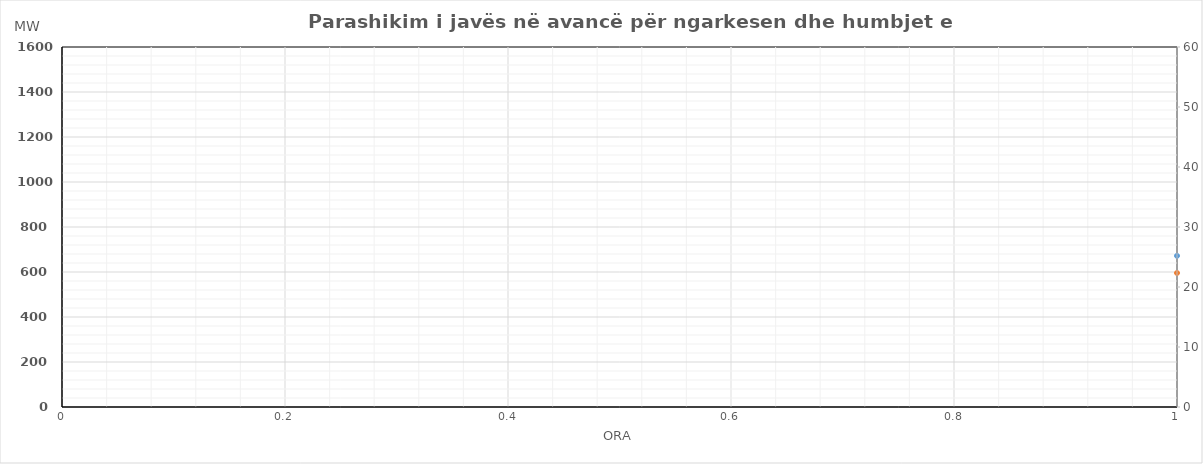
| Category | Ngarkesa (MWh) |
|---|---|
| 0 | 595.73 |
| 1 | 536.53 |
| 2 | 535.73 |
| 3 | 531.58 |
| 4 | 535.89 |
| 5 | 568.72 |
| 6 | 752.35 |
| 7 | 970.69 |
| 8 | 1006.83 |
| 9 | 981.42 |
| 10 | 953.72 |
| 11 | 986.3 |
| 12 | 998.6 |
| 13 | 1046.83 |
| 14 | 1080.29 |
| 15 | 1100.8 |
| 16 | 1176.19 |
| 17 | 1206.28 |
| 18 | 1210.4 |
| 19 | 1189.65 |
| 20 | 1149.94 |
| 21 | 1053.47 |
| 22 | 930.76 |
| 23 | 785.29 |
| 24 | 626.52 |
| 25 | 582.42 |
| 26 | 580.03 |
| 27 | 580.93 |
| 28 | 582.71 |
| 29 | 596.02 |
| 30 | 783.03 |
| 31 | 1019.26 |
| 32 | 1058.46 |
| 33 | 1034.18 |
| 34 | 999.15 |
| 35 | 987.71 |
| 36 | 983.87 |
| 37 | 1010.1 |
| 38 | 1043.5 |
| 39 | 1057.93 |
| 40 | 1135.84 |
| 41 | 1226.83 |
| 42 | 1231.94 |
| 43 | 1218.46 |
| 44 | 1175.26 |
| 45 | 1081.55 |
| 46 | 955.39 |
| 47 | 802.91 |
| 48 | 626.52 |
| 49 | 582.42 |
| 50 | 580.03 |
| 51 | 580.93 |
| 52 | 582.71 |
| 53 | 596.02 |
| 54 | 783.03 |
| 55 | 1019.26 |
| 56 | 1058.46 |
| 57 | 1034.18 |
| 58 | 999.15 |
| 59 | 1087.71 |
| 60 | 1081.87 |
| 61 | 1153.1 |
| 62 | 1148.5 |
| 63 | 1135.93 |
| 64 | 1230.84 |
| 65 | 1256.83 |
| 66 | 1261.94 |
| 67 | 1263.46 |
| 68 | 1245.26 |
| 69 | 1156.55 |
| 70 | 1045.39 |
| 71 | 892.91 |
| 72 | 629.38 |
| 73 | 558.27 |
| 74 | 548.65 |
| 75 | 542.74 |
| 76 | 545.25 |
| 77 | 605.14 |
| 78 | 801.15 |
| 79 | 1046 |
| 80 | 1084.6 |
| 81 | 1131.57 |
| 82 | 1107.92 |
| 83 | 1107.5 |
| 84 | 1108.61 |
| 85 | 1127.31 |
| 86 | 1140.78 |
| 87 | 1127.86 |
| 88 | 1210.86 |
| 89 | 1296.2 |
| 90 | 1274.88 |
| 91 | 1260.46 |
| 92 | 1228.77 |
| 93 | 1164.34 |
| 94 | 1004.54 |
| 95 | 827.01 |
| 96 | 643.55 |
| 97 | 573.42 |
| 98 | 540.92 |
| 99 | 531.33 |
| 100 | 542.24 |
| 101 | 614.81 |
| 102 | 802.18 |
| 103 | 1053.23 |
| 104 | 1137.89 |
| 105 | 1152.3 |
| 106 | 1125.81 |
| 107 | 1155.59 |
| 108 | 1157.96 |
| 109 | 1170.07 |
| 110 | 1178.27 |
| 111 | 1187.12 |
| 112 | 1285.08 |
| 113 | 1336.56 |
| 114 | 1312.97 |
| 115 | 1292.65 |
| 116 | 1249.8 |
| 117 | 1150.75 |
| 118 | 979.16 |
| 119 | 794.85 |
| 120 | 595.73 |
| 121 | 536.53 |
| 122 | 535.73 |
| 123 | 531.58 |
| 124 | 535.89 |
| 125 | 568.72 |
| 126 | 752.35 |
| 127 | 970.69 |
| 128 | 1006.83 |
| 129 | 981.42 |
| 130 | 953.72 |
| 131 | 986.3 |
| 132 | 998.6 |
| 133 | 1046.83 |
| 134 | 1080.29 |
| 135 | 1100.8 |
| 136 | 1176.19 |
| 137 | 1206.28 |
| 138 | 1210.4 |
| 139 | 1189.65 |
| 140 | 1149.94 |
| 141 | 1053.47 |
| 142 | 930.76 |
| 143 | 785.29 |
| 144 | 626.52 |
| 145 | 582.42 |
| 146 | 580.03 |
| 147 | 580.93 |
| 148 | 582.71 |
| 149 | 596.02 |
| 150 | 783.03 |
| 151 | 1019.26 |
| 152 | 1058.46 |
| 153 | 1034.18 |
| 154 | 999.15 |
| 155 | 987.71 |
| 156 | 983.87 |
| 157 | 1010.1 |
| 158 | 1043.5 |
| 159 | 1057.93 |
| 160 | 1135.84 |
| 161 | 1226.83 |
| 162 | 1231.94 |
| 163 | 1218.46 |
| 164 | 1175.26 |
| 165 | 1081.55 |
| 166 | 955.39 |
| 167 | 802.91 |